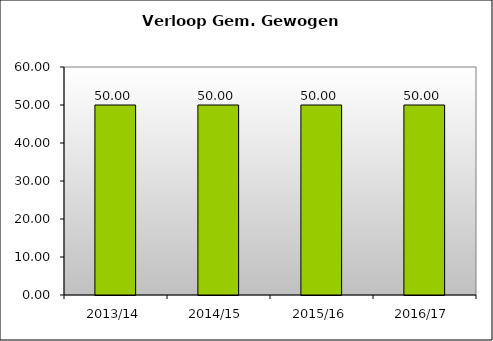
| Category | Series 0 |
|---|---|
| 2013/14 | 50 |
| 2014/15 | 50 |
| 2015/16 | 50 |
| 2016/17 | 50 |